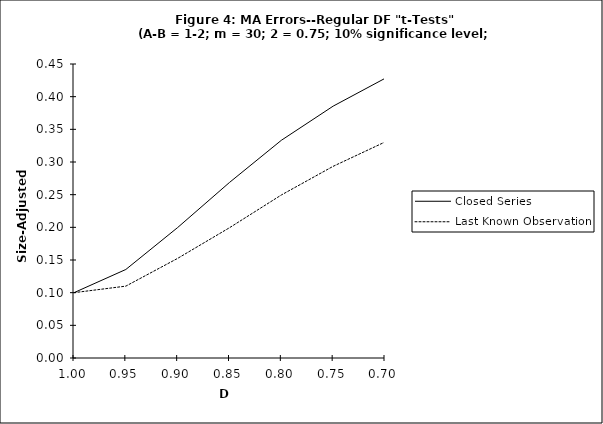
| Category | Closed Series | Last Known Observation |
|---|---|---|
| 1.0 | 0.1 | 0.1 |
| 0.95 | 0.136 | 0.11 |
| 0.9 | 0.2 | 0.152 |
| 0.85 | 0.269 | 0.199 |
| 0.8 | 0.333 | 0.25 |
| 0.75 | 0.386 | 0.293 |
| 0.7 | 0.428 | 0.331 |